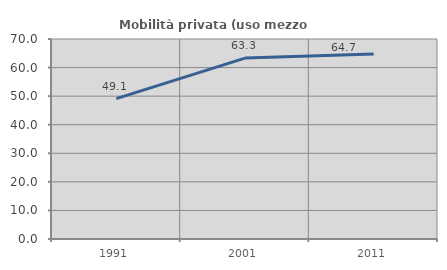
| Category | Mobilità privata (uso mezzo privato) |
|---|---|
| 1991.0 | 49.148 |
| 2001.0 | 63.327 |
| 2011.0 | 64.745 |